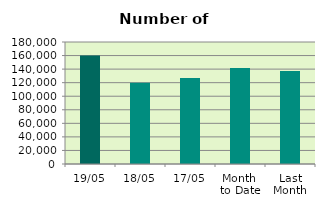
| Category | Series 0 |
|---|---|
| 19/05 | 160146 |
| 18/05 | 119984 |
| 17/05 | 126958 |
| Month 
to Date | 141573.846 |
| Last
Month | 137031.8 |